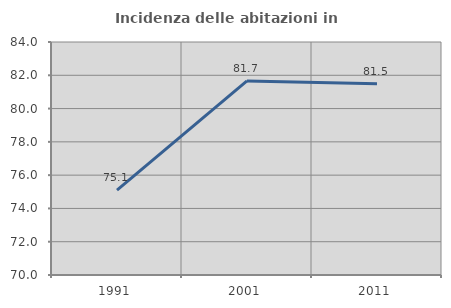
| Category | Incidenza delle abitazioni in proprietà  |
|---|---|
| 1991.0 | 75.098 |
| 2001.0 | 81.658 |
| 2011.0 | 81.489 |